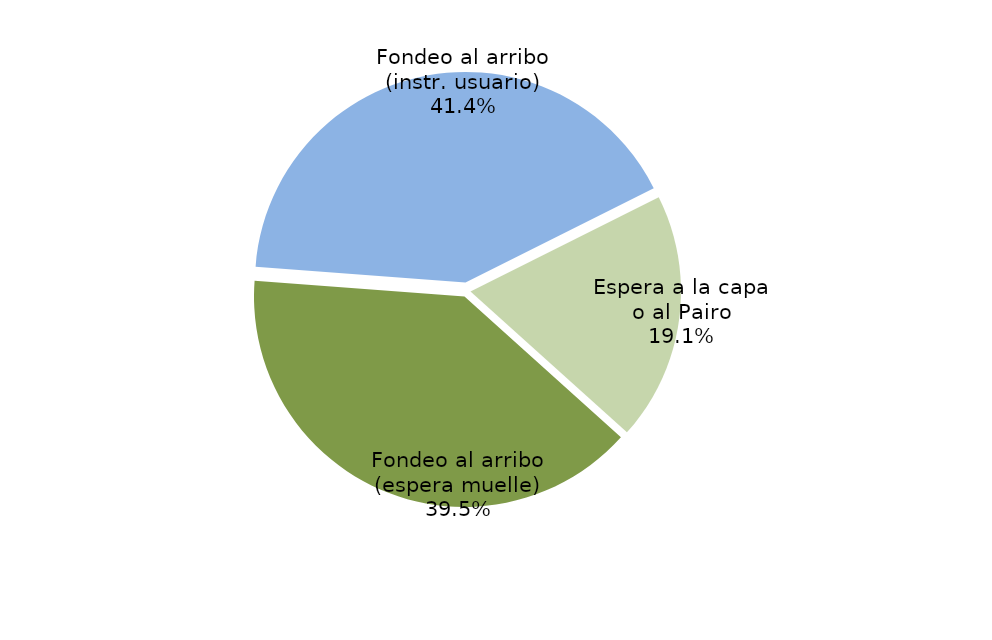
| Category | Series 0 |
|---|---|
| Fondeo al arribo (espera muelle) | 20469.1 |
| Fondeo al arribo (instr. usuario) | 21441.967 |
| Espera a la capa o al Pairo | 9865.6 |